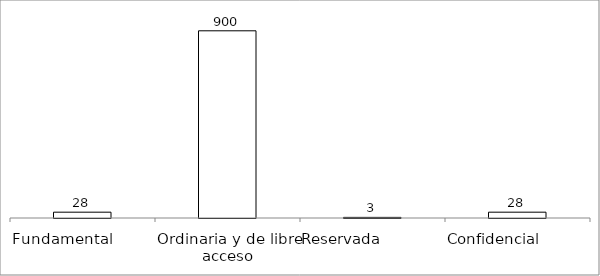
| Category | Series 0 |
|---|---|
| Fundamental         | 28 |
| Ordinaria y de libre acceso | 900 |
| Reservada               | 3 |
| Confidencial             | 28 |